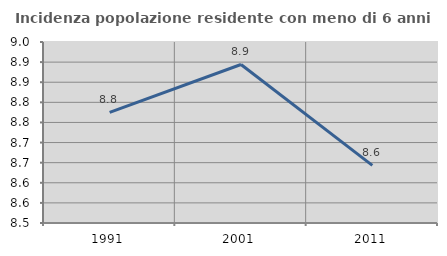
| Category | Incidenza popolazione residente con meno di 6 anni |
|---|---|
| 1991.0 | 8.775 |
| 2001.0 | 8.894 |
| 2011.0 | 8.643 |